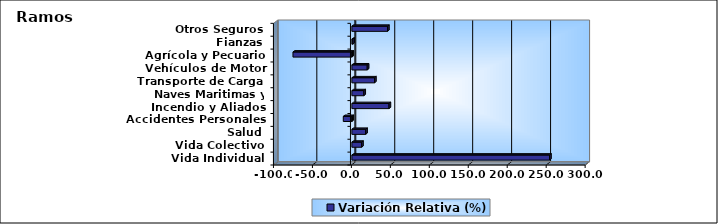
| Category | Variación Relativa (%) |
|---|---|
| Vida Individual | 253.737 |
| Vida Colectivo | 12.484 |
| Salud | 17.671 |
| Accidentes Personales | -11.02 |
| Incendio y Aliados | 47.653 |
| Naves Maritimas y Aéreas | 15.294 |
| Transporte de Carga | 29.068 |
| Vehículos de Motor | 19.694 |
| Agrícola y Pecuario | -75.602 |
| Fianzas | 1.171 |
| Otros Seguros | 45.723 |